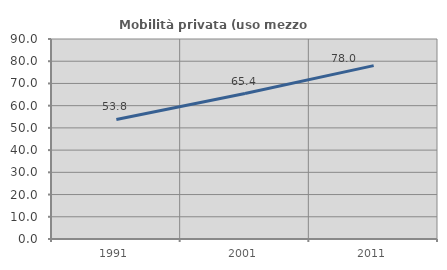
| Category | Mobilità privata (uso mezzo privato) |
|---|---|
| 1991.0 | 53.803 |
| 2001.0 | 65.443 |
| 2011.0 | 78.014 |